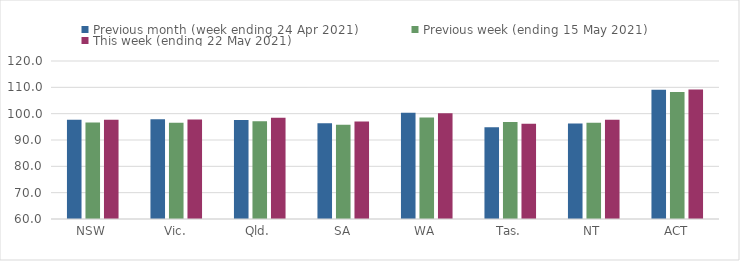
| Category | Previous month (week ending 24 Apr 2021) | Previous week (ending 15 May 2021) | This week (ending 22 May 2021) |
|---|---|---|---|
| NSW | 97.68 | 96.67 | 97.7 |
| Vic. | 97.88 | 96.55 | 97.82 |
| Qld. | 97.64 | 97.08 | 98.49 |
| SA | 96.33 | 95.76 | 96.99 |
| WA | 100.37 | 98.55 | 100.18 |
| Tas. | 94.84 | 96.87 | 96.13 |
| NT | 96.31 | 96.59 | 97.72 |
| ACT | 109.12 | 108.24 | 109.16 |